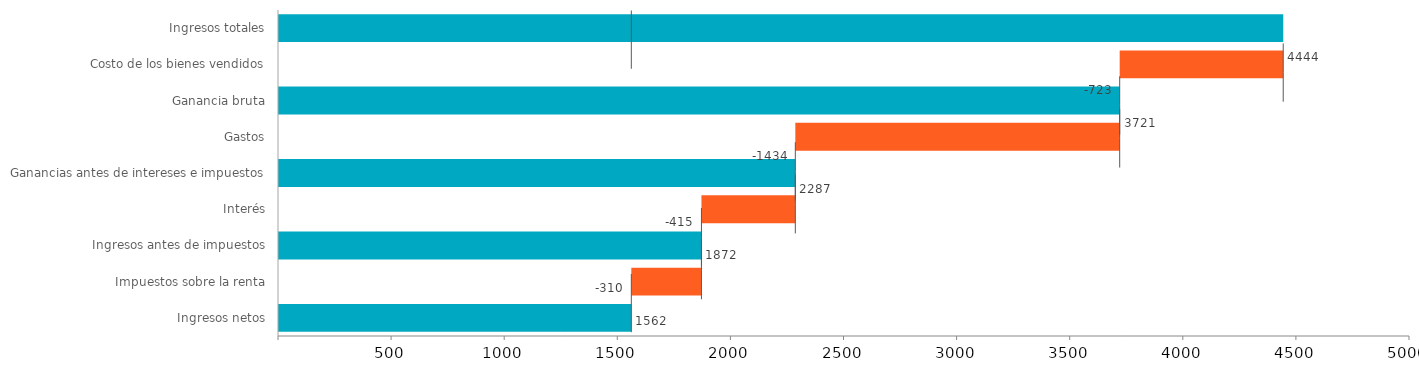
| Category | Finaliza | Blanco | Pérdida negativa | Ganancia negativa | Pérdida positiva | Ganancia positiva |
|---|---|---|---|---|---|---|
| Ingresos totales | 4444 | 0 | 0 | 0 | 0 | 0 |
| Costo de los bienes vendidos | 0 | 3721 | 0 | 0 | 723 | 0 |
| Ganancia bruta | 3721 | 0 | 0 | 0 | 0 | 0 |
| Gastos | 0 | 2287 | 0 | 0 | 1434 | 0 |
| Ganancias antes de intereses e impuestos | 2287 | 0 | 0 | 0 | 0 | 0 |
| Interés | 0 | 1872 | 0 | 0 | 415 | 0 |
| Ingresos antes de impuestos | 1872 | 0 | 0 | 0 | 0 | 0 |
| Impuestos sobre la renta | 0 | 1562 | 0 | 0 | 310 | 0 |
| Ingresos netos | 1562 | 0 | 0 | 0 | 0 | 0 |